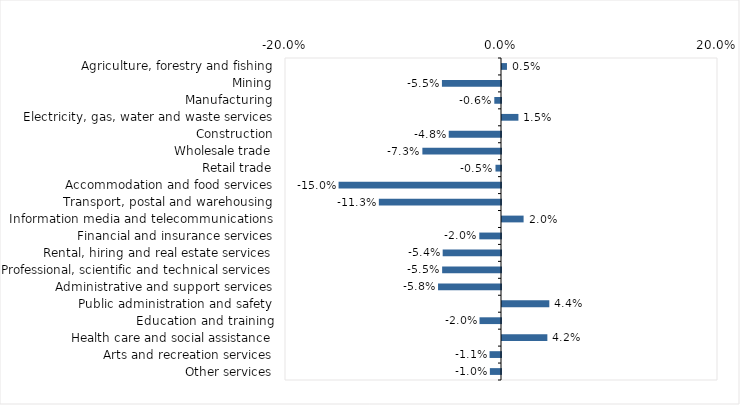
| Category | This week |
|---|---|
| Agriculture, forestry and fishing | 0.005 |
| Mining | -0.055 |
| Manufacturing | -0.006 |
| Electricity, gas, water and waste services | 0.015 |
| Construction | -0.048 |
| Wholesale trade | -0.073 |
| Retail trade | -0.005 |
| Accommodation and food services | -0.15 |
| Transport, postal and warehousing | -0.113 |
| Information media and telecommunications | 0.02 |
| Financial and insurance services | -0.02 |
| Rental, hiring and real estate services | -0.054 |
| Professional, scientific and technical services | -0.054 |
| Administrative and support services | -0.058 |
| Public administration and safety | 0.044 |
| Education and training | -0.02 |
| Health care and social assistance | 0.042 |
| Arts and recreation services | -0.011 |
| Other services | -0.01 |